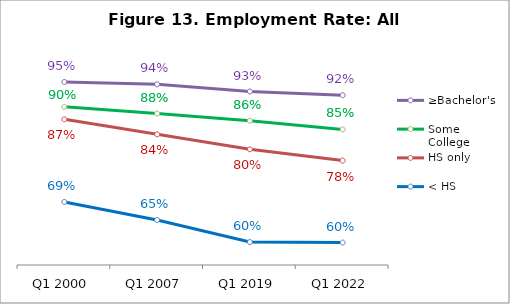
| Category | ≥Bachelor's | Some College | HS only | < HS |
|---|---|---|---|---|
| Q1 2000 | 0.95 | 0.895 | 0.868 | 0.688 |
| Q1 2007 | 0.944 | 0.881 | 0.835 | 0.648 |
| Q1 2019 | 0.929 | 0.865 | 0.803 | 0.6 |
| Q1 2022 | 0.921 | 0.846 | 0.778 | 0.599 |